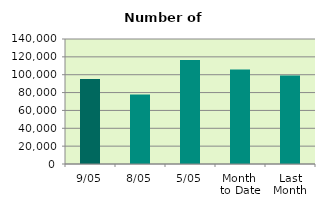
| Category | Series 0 |
|---|---|
| 9/05 | 95238 |
| 8/05 | 77724 |
| 5/05 | 116560 |
| Month 
to Date | 105963.333 |
| Last
Month | 99222.444 |